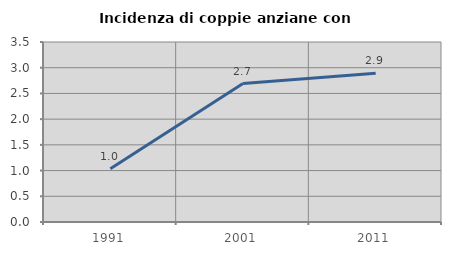
| Category | Incidenza di coppie anziane con figli |
|---|---|
| 1991.0 | 1.036 |
| 2001.0 | 2.692 |
| 2011.0 | 2.894 |